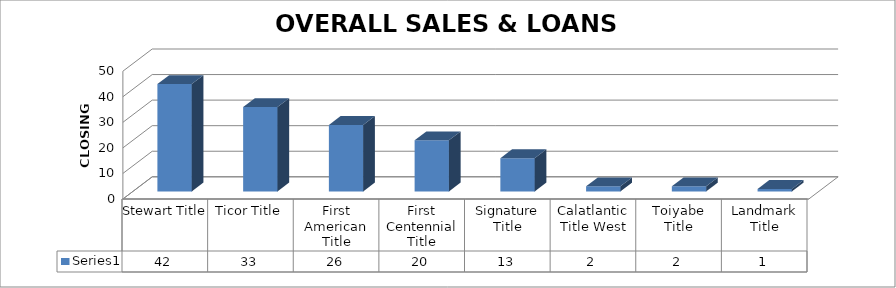
| Category | Series 0 |
|---|---|
| Stewart Title | 42 |
| Ticor Title | 33 |
| First American Title | 26 |
| First Centennial Title | 20 |
| Signature Title | 13 |
| Calatlantic Title West | 2 |
| Toiyabe Title | 2 |
| Landmark Title | 1 |